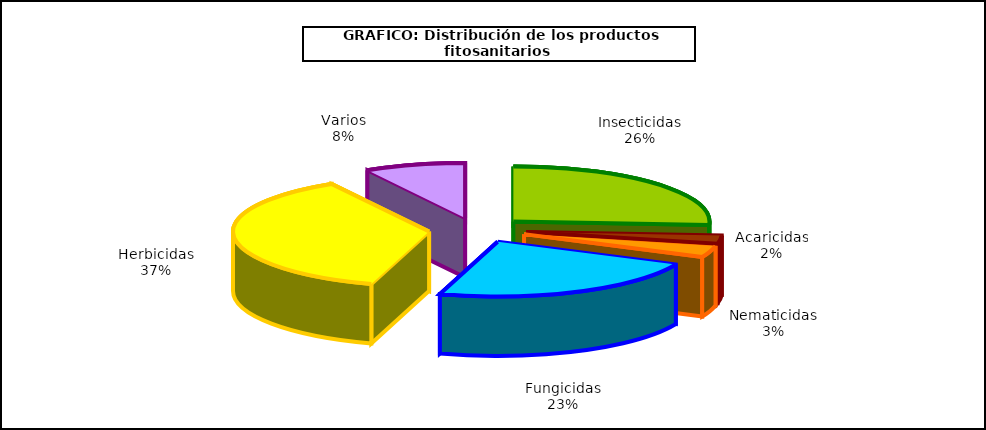
| Category | Insecticidas Acaricidas Nematicidas Fungicidas Herbicidas Varios |
|---|---|
| Insecticidas | 256.472 |
| Acaricidas | 23.774 |
| Nematicidas | 33.495 |
| Fungicidas | 225.514 |
| Herbicidas | 363.843 |
| Varios | 81.707 |